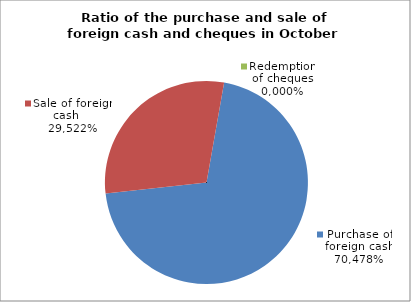
| Category | Purchase of foreign cash |
|---|---|
| 0 | 0.705 |
| 1 | 0.295 |
| 2 | 0 |